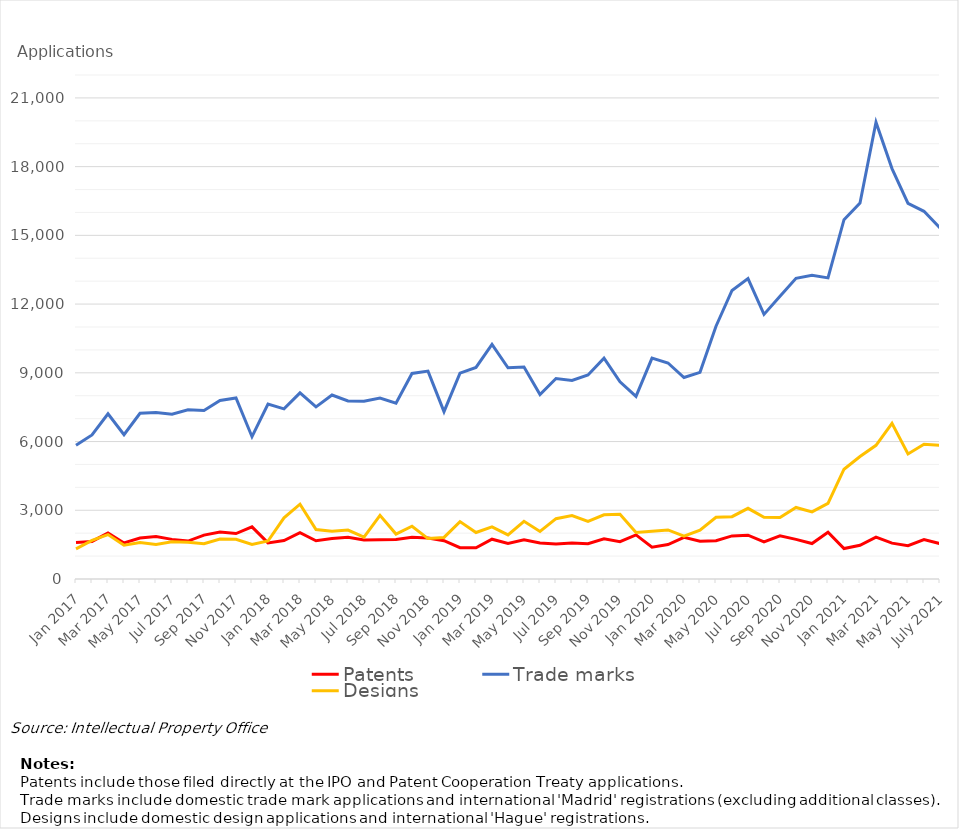
| Category | Patents | Trade marks | Designs |
|---|---|---|---|
| Jan 2017 | 1596 | 5843 | 1318 |
| Feb 2017 | 1640 | 6288 | 1687 |
| Mar 2017 | 2011 | 7214 | 1940 |
| Apr 2017 | 1573 | 6297 | 1474 |
| May 2017 | 1790 | 7234 | 1592 |
| Jun 2017 | 1853 | 7263 | 1502 |
| Jul 2017 | 1730 | 7197 | 1627 |
| Aug 2017 | 1657 | 7389 | 1600 |
| Sep 2017 | 1915 | 7359 | 1544 |
| Oct 2017 | 2055 | 7792 | 1745 |
| Nov 2017 | 1983 | 7901 | 1736 |
| Dec 2017 | 2277 | 6211 | 1507 |
| Jan 2018 | 1575 | 7634 | 1658 |
| Feb 2018 | 1676 | 7428 | 2672 |
| Mar 2018 | 2022 | 8127 | 3267 |
| Apr 2018 | 1670 | 7512 | 2160 |
| May 2018 | 1767 | 8030 | 2083 |
| Jun 2018 | 1821 | 7769 | 2136 |
| Jul 2018 | 1704 | 7757 | 1832 |
| Aug 2018 | 1713 | 7897 | 2777 |
| Sep 2018 | 1725 | 7673 | 1960 |
| Oct 2018 | 1818 | 8972 | 2302 |
| Nov 2018 | 1787 | 9076 | 1765 |
| Dec 2018 | 1670 | 7304 | 1815 |
| Jan 2019 | 1367 | 8984 | 2505 |
| Feb 2019 | 1361 | 9234 | 2031 |
| Mar 2019 | 1737 | 10243 | 2274 |
| Apr 2019 | 1552 | 9219 | 1923 |
| May 2019 | 1710 | 9251 | 2520 |
| Jun 2019 | 1569 | 8053 | 2074 |
| Jul 2019 | 1527 | 8752 | 2634 |
| Aug 2019 | 1571 | 8670 | 2768 |
| Sep 2019 | 1540 | 8907 | 2511 |
| Oct 2019 | 1755 | 9636 | 2800 |
| Nov 2019 | 1630 | 8607 | 2827 |
| Dec 2019 | 1926 | 7970 | 2028 |
| Jan 2020 | 1392 | 9642 | 2082 |
| Feb 2020 | 1506 | 9428 | 2143 |
| Mar 2020 | 1819 | 8794 | 1871 |
| Apr 2020 | 1648 | 9021 | 2127 |
| May 2020 | 1671 | 11035 | 2694 |
| Jun 2020 | 1880 | 12593 | 2721 |
| Jul 2020 | 1911 | 13110 | 3085 |
| Aug 2020 | 1616 | 11551 | 2694 |
| Sep 2020 | 1886 | 12340 | 2686 |
| Oct 2020 | 1731 | 13126 | 3124 |
| Nov 2020 | 1548 | 13254 | 2930 |
| Dec 2020 | 2043 | 13143 | 3303 |
| Jan 2021 | 1330 | 15686 | 4792 |
| Feb 2021 | 1472 | 16412 | 5347 |
| Mar 2021 | 1831 | 19936 | 5836 |
| Apr 2021 | 1565 | 17914 | 6794 |
| May 2021 | 1455 | 16398 | 5458 |
| June 2021 | 1719 | 16049 | 5880 |
| July 2021 | 1543 | 15319 | 5840 |